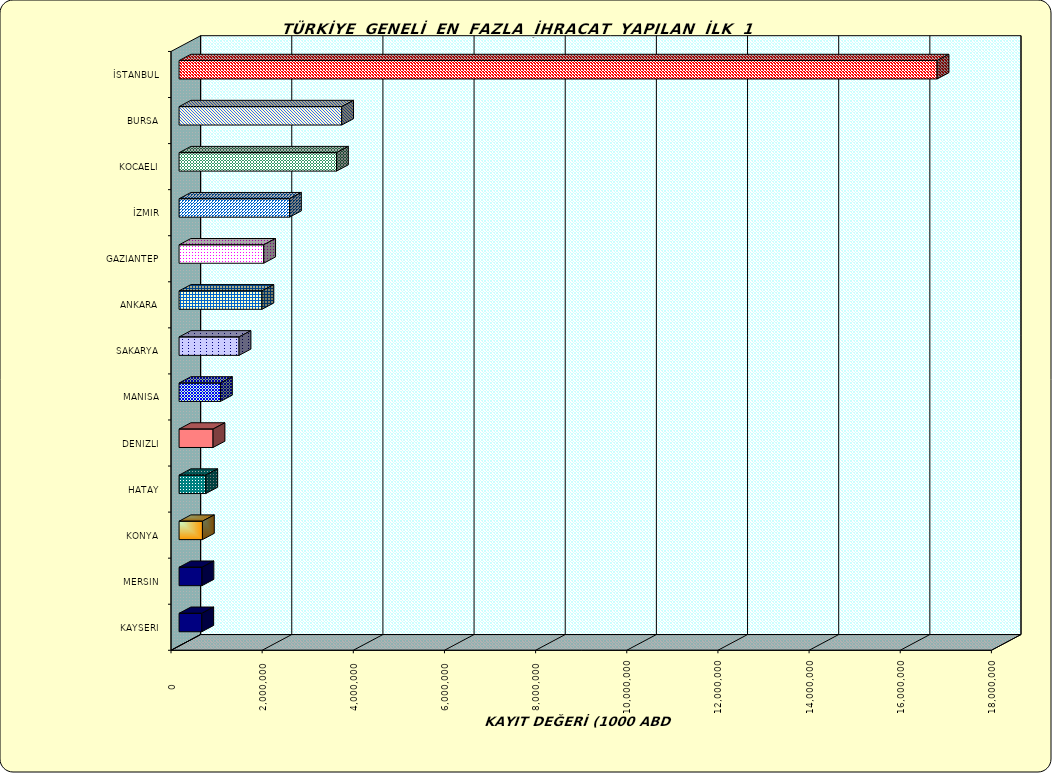
| Category | Series 0 |
|---|---|
| İSTANBUL | 16631759.536 |
| BURSA | 3567653.215 |
| KOCAELI | 3454040.596 |
| İZMIR | 2423154.298 |
| GAZIANTEP | 1856832.045 |
| ANKARA | 1818331.378 |
| SAKARYA | 1316137.42 |
| MANISA | 908819.271 |
| DENIZLI | 745326.606 |
| HATAY | 586540.422 |
| KONYA | 512771.034 |
| MERSIN | 502858.947 |
| KAYSERI | 498748.164 |